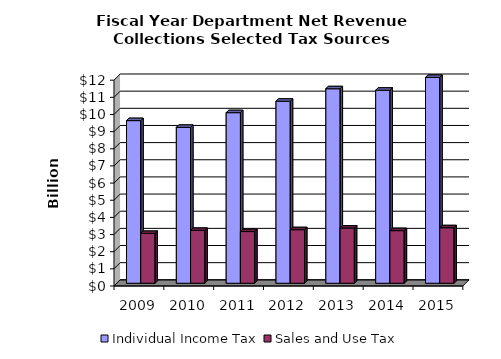
| Category | Individual Income Tax | Sales and Use Tax |
|---|---|---|
| 2009.0 | 9.481 | 2.904 |
| 2010.0 | 9.088 | 3.083 |
| 2011.0 | 9.944 | 3.012 |
| 2012.0 | 10.613 | 3.122 |
| 2013.0 | 11.34 | 3.22 |
| 2014.0 | 11.253 | 3.066 |
| 2015.0 | 12.329 | 3.235 |